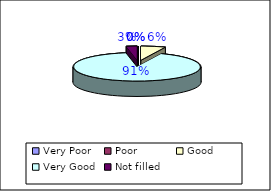
| Category | Overall how would you rate the service |
|---|---|
| Very Poor | 0 |
| Poor | 0 |
| Good | 9 |
| Very Good | 131 |
| Not filled  | 4 |